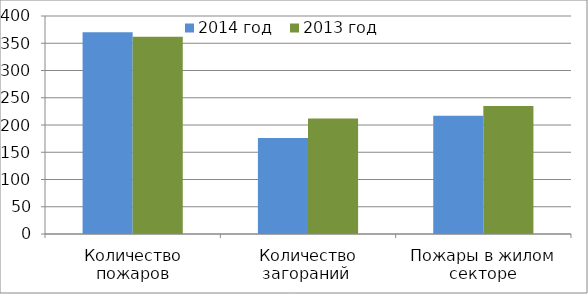
| Category | 2014 год | 2013 год |
|---|---|---|
| Количество пожаров | 370 | 362 |
| Количество загораний  | 176 | 212 |
| Пожары в жилом секторе | 217 | 235 |